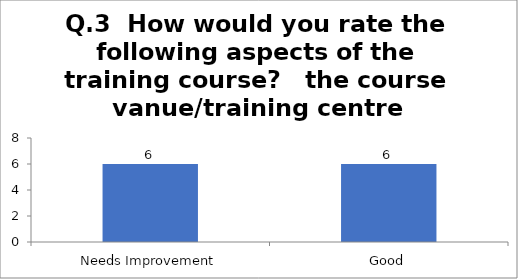
| Category | Q.3  How would you rate the following aspects of the training course?   the course vanue/training centre |
|---|---|
| Needs Improvement | 6 |
| Good | 6 |